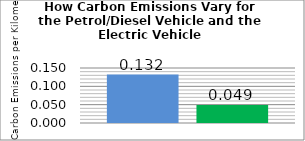
| Category | Petrol/Diesel | EV |
|---|---|---|
| 0 | 0.132 | 0.049 |